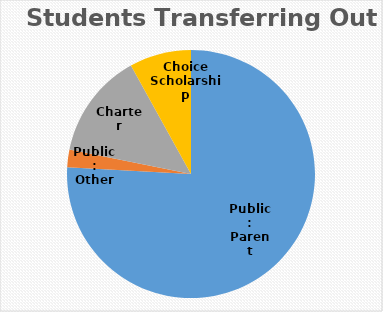
| Category | Series 0 |
|---|---|
| Public: Parent Choice | 66 |
| Public: Other | 2 |
| Charter | 12 |
| Choice Scholarship | 7 |